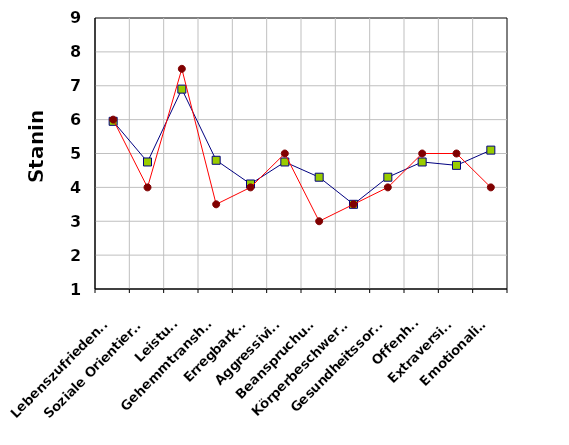
| Category | Bewerber-Gruppe | Experten-Profilvorgabe |
|---|---|---|
| Lebenszufriedenheit | 5.95 | 6 |
| Soziale Orientierung | 4.75 | 4 |
| Leistung | 6.9 | 7.5 |
| Gehemmtransheit | 4.8 | 3.5 |
| Erregbarkeit | 4.1 | 4 |
| Aggressivität | 4.75 | 5 |
| Beanspruchung | 4.3 | 3 |
| Körperbeschwerden | 3.5 | 3.5 |
| Gesundheitssorgen | 4.3 | 4 |
| Offenheit | 4.75 | 5 |
| Extraversion | 4.65 | 5 |
| Emotionalität | 5.1 | 4 |